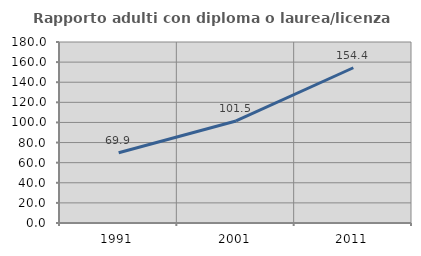
| Category | Rapporto adulti con diploma o laurea/licenza media  |
|---|---|
| 1991.0 | 69.871 |
| 2001.0 | 101.485 |
| 2011.0 | 154.396 |